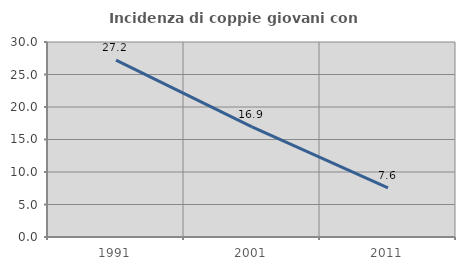
| Category | Incidenza di coppie giovani con figli |
|---|---|
| 1991.0 | 27.206 |
| 2001.0 | 16.939 |
| 2011.0 | 7.557 |